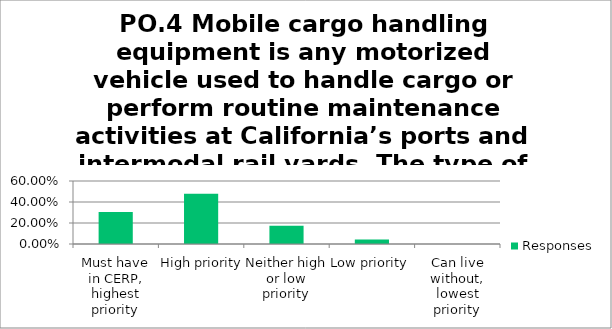
| Category | Responses |
|---|---|
| Must have in CERP, highest priority | 0.304 |
| High priority | 0.478 |
| Neither high or low priority | 0.174 |
| Low priority | 0.044 |
| Can live without, lowest priority | 0 |